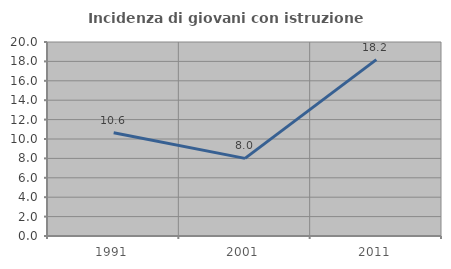
| Category | Incidenza di giovani con istruzione universitaria |
|---|---|
| 1991.0 | 10.638 |
| 2001.0 | 8 |
| 2011.0 | 18.182 |